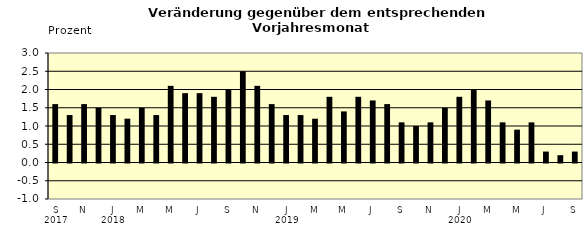
| Category | Series 0 |
|---|---|
| 0 | 1.6 |
| 1 | 1.3 |
| 2 | 1.6 |
| 3 | 1.5 |
| 4 | 1.3 |
| 5 | 1.2 |
| 6 | 1.5 |
| 7 | 1.3 |
| 8 | 2.1 |
| 9 | 1.9 |
| 10 | 1.9 |
| 11 | 1.8 |
| 12 | 2 |
| 13 | 2.5 |
| 14 | 2.1 |
| 15 | 1.6 |
| 16 | 1.3 |
| 17 | 1.3 |
| 18 | 1.2 |
| 19 | 1.8 |
| 20 | 1.4 |
| 21 | 1.8 |
| 22 | 1.7 |
| 23 | 1.6 |
| 24 | 1.1 |
| 25 | 1 |
| 26 | 1.1 |
| 27 | 1.5 |
| 28 | 1.8 |
| 29 | 2 |
| 30 | 1.7 |
| 31 | 1.1 |
| 32 | 0.9 |
| 33 | 1.1 |
| 34 | 0.3 |
| 35 | 0.2 |
| 36 | 0.3 |